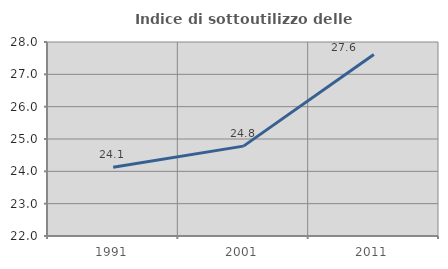
| Category | Indice di sottoutilizzo delle abitazioni  |
|---|---|
| 1991.0 | 24.129 |
| 2001.0 | 24.779 |
| 2011.0 | 27.614 |